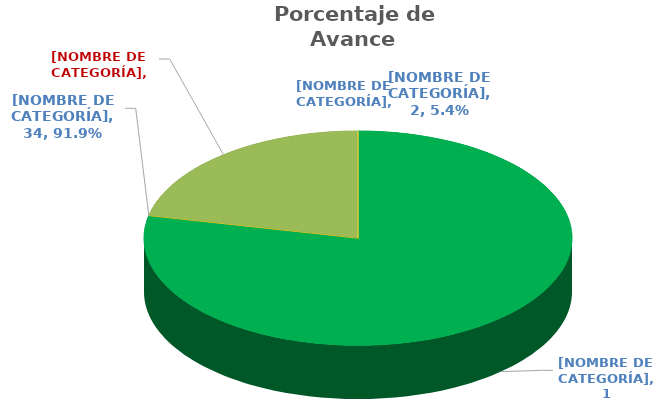
| Category | 78.4% |
|---|---|
| FINALIZADAS | 0.784 |
| EN  PROCESO | 0 |
| VENCIDAS CON AVANCE | 0.216 |
| VENCIDAS SIN AVANCE | 0 |
| NO INICIADAS | 0 |